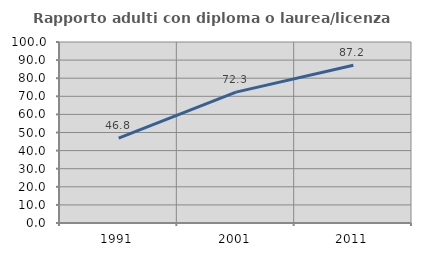
| Category | Rapporto adulti con diploma o laurea/licenza media  |
|---|---|
| 1991.0 | 46.839 |
| 2001.0 | 72.289 |
| 2011.0 | 87.169 |